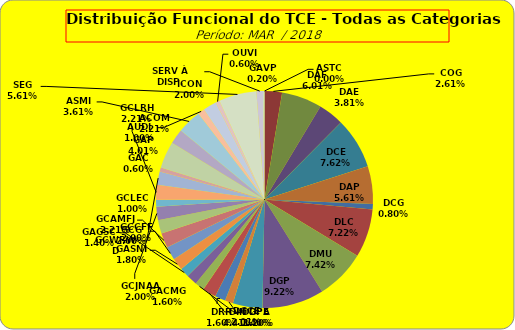
| Category | ASTC |
|---|---|
| ASTC | 0 |
| COG | 13 |
| DAF | 30 |
| DAE | 19 |
| DCE | 38 |
| DAP | 28 |
| DCG | 4 |
| DLC | 36 |
| DMU | 37 |
| DGP | 46 |
| DIN | 22 |
| DPE | 6 |
| DRR | 8 |
| DGCE | 10 |
| DGPA | 7 |
| GACMG | 8 |
| GAGSC | 7 |
| GASNI | 9 |
| GCG | 10 |
| GCAMFJ | 11 |
| GCCFF | 10 |
| GCJNAA | 10 |
| GCLEC | 5 |
| GCLRH | 11 |
| GCWRWD | 10 |
| GAC | 3 |
| GAP | 20 |
| ACOM | 11 |
| ASMI | 18 |
| AUDI | 5 |
| ICON | 10 |
| OUVI | 3 |
| SEG | 28 |
| SERV À DISP. | 5 |
| GAVP | 1 |